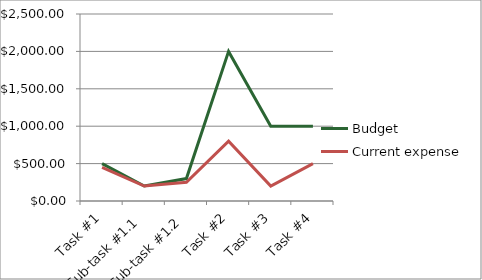
| Category | Budget | Current expense |
|---|---|---|
| Task #1 | 500 | 450 |
| Sub-task #1.1 | 200 | 200 |
| Sub-task #1.2 | 300 | 250 |
| Task #2 | 2000 | 800 |
| Task #3 | 1000 | 200 |
| Task #4 | 1000 | 500 |